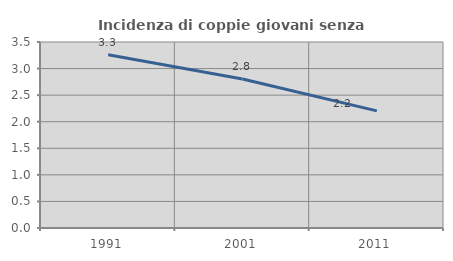
| Category | Incidenza di coppie giovani senza figli |
|---|---|
| 1991.0 | 3.262 |
| 2001.0 | 2.804 |
| 2011.0 | 2.204 |